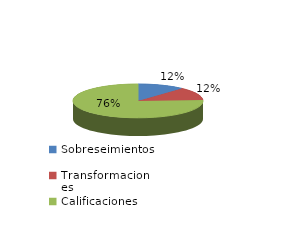
| Category | Series 0 |
|---|---|
| Sobreseimientos | 367 |
| Transformaciones | 391 |
| Calificaciones | 2372 |